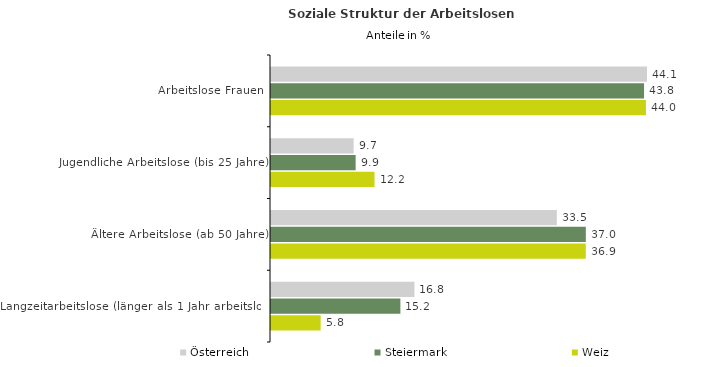
| Category | Österreich | Steiermark | Weiz |
|---|---|---|---|
| Arbeitslose Frauen | 44.136 | 43.785 | 44.007 |
| Jugendliche Arbeitslose (bis 25 Jahre) | 9.698 | 9.935 | 12.151 |
| Ältere Arbeitslose (ab 50 Jahre) | 33.548 | 36.954 | 36.946 |
| Langzeitarbeitslose (länger als 1 Jahr arbeitslos) | 16.836 | 15.186 | 5.829 |